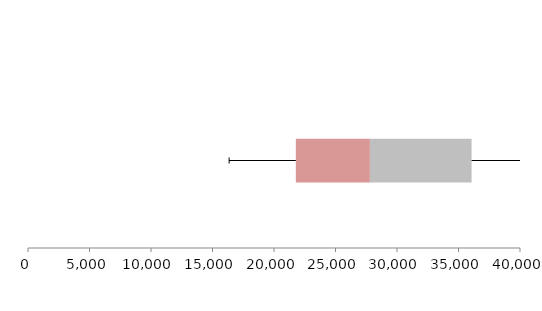
| Category | Series 1 | Series 2 | Series 3 |
|---|---|---|---|
| 0 | 21775.519 | 6021.723 | 8266.145 |